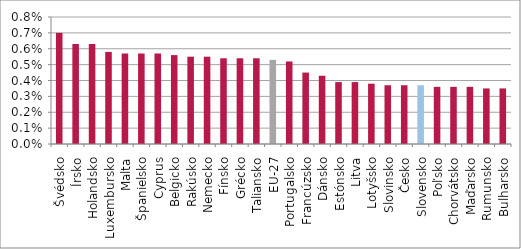
| Category | val |
|---|---|
| Švédsko | 0.007 |
| Írsko | 0.006 |
| Holandsko | 0.006 |
| Luxembursko | 0.006 |
| Malta | 0.006 |
| Španielsko | 0.006 |
| Cyprus | 0.006 |
| Belgicko | 0.006 |
| Rakúsko | 0.006 |
| Nemecko | 0.006 |
| Fínsko | 0.005 |
| Grécko | 0.005 |
| Taliansko | 0.005 |
| EU-27 | 0.005 |
| Portugalsko | 0.005 |
| Francúzsko | 0.004 |
| Dánsko | 0.004 |
| Estónsko | 0.004 |
| Litva | 0.004 |
| Lotyšsko | 0.004 |
| Slovinsko | 0.004 |
| Česko | 0.004 |
| Slovensko | 0.004 |
| Poľsko | 0.004 |
| Chorvátsko | 0.004 |
| Maďarsko | 0.004 |
| Rumunsko | 0.004 |
| Bulharsko | 0.004 |